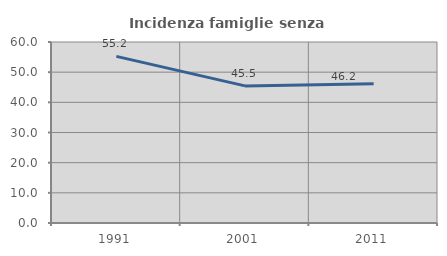
| Category | Incidenza famiglie senza nuclei |
|---|---|
| 1991.0 | 55.224 |
| 2001.0 | 45.455 |
| 2011.0 | 46.154 |